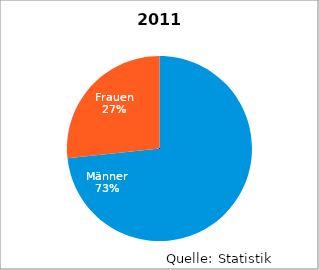
| Category | 2011 |
|---|---|
| Männer | 11 |
| Frauen | 4 |